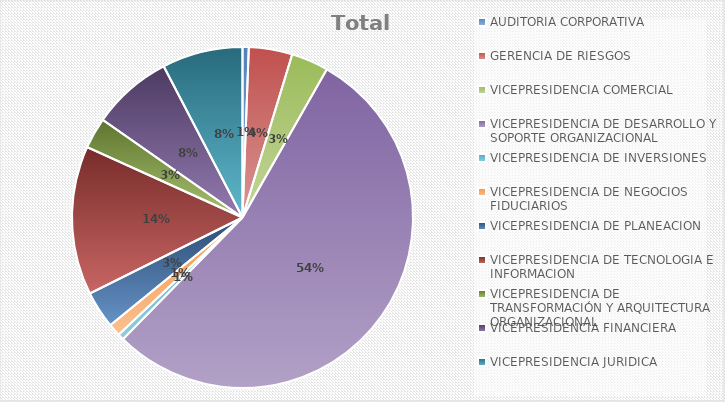
| Category | Total general |
|---|---|
| AUDITORIA CORPORATIVA | 1 |
| GERENCIA DE RIESGOS | 7 |
| VICEPRESIDENCIA COMERCIAL | 6 |
| VICEPRESIDENCIA DE DESARROLLO Y SOPORTE ORGANIZACIONAL | 92 |
| VICEPRESIDENCIA DE INVERSIONES  | 1 |
| VICEPRESIDENCIA DE NEGOCIOS FIDUCIARIOS | 2 |
| VICEPRESIDENCIA DE PLANEACION | 6 |
| VICEPRESIDENCIA DE TECNOLOGIA E INFORMACION | 24 |
| VICEPRESIDENCIA DE TRANSFORMACIÓN Y ARQUITECTURA ORGANIZACIONAL | 5 |
| VICEPRESIDENCIA FINANCIERA | 13 |
| VICEPRESIDENCIA JURIDICA | 13 |